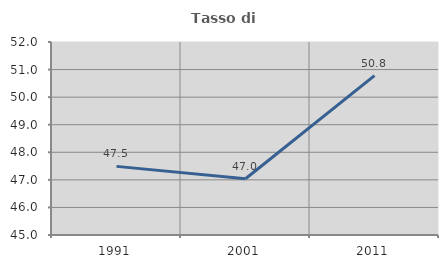
| Category | Tasso di occupazione   |
|---|---|
| 1991.0 | 47.489 |
| 2001.0 | 47.042 |
| 2011.0 | 50.781 |